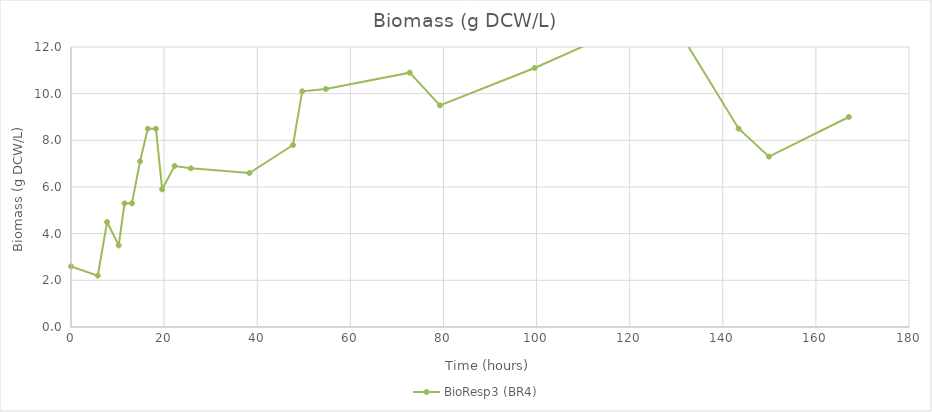
| Category | BioResp3 (BR4) |
|---|---|
| 0.0 | 2.6 |
| 5.750000000058208 | 2.2 |
| 7.749999999941792 | 4.5 |
| 10.250000000058208 | 3.5 |
| 11.499999999941792 | 5.3 |
| 13.083333333372138 | 5.3 |
| 14.83333333331393 | 7.1 |
| 16.5 | 8.5 |
| 18.249999999941792 | 8.5 |
| 19.583333333255723 | 5.9 |
| 22.250000000058208 | 6.9 |
| 25.749999999941792 | 6.8 |
| 38.33333333325572 | 6.6 |
| 47.683333333348855 | 7.8 |
| 49.66666666668607 | 10.1 |
| 54.75 | 10.2 |
| 72.75 | 10.9 |
| 79.25000000005821 | 9.5 |
| 99.58333333331393 | 11.1 |
| 127.74999999994179 | 13.6 |
| 143.41666666668607 | 8.5 |
| 149.91666666674428 | 7.3 |
| 167.08333333331393 | 9 |